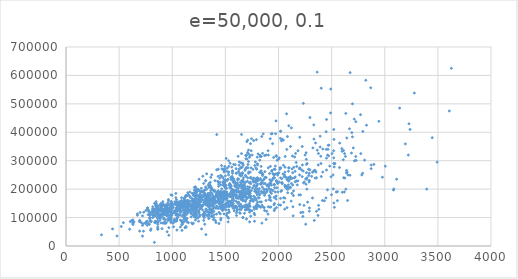
| Category | Series 0 |
|---|---|
| 1710.0 | 208500 |
| 1262.0 | 181500 |
| 1786.0 | 223500 |
| 1717.0 | 140000 |
| 2198.0 | 250000 |
| 1362.0 | 143000 |
| 1694.0 | 307000 |
| 2090.0 | 200000 |
| 1774.0 | 129900 |
| 1077.0 | 118000 |
| 1040.0 | 129500 |
| 2324.0 | 345000 |
| 912.0 | 144000 |
| 1494.0 | 279500 |
| 1253.0 | 157000 |
| 854.0 | 132000 |
| 1004.0 | 149000 |
| 1296.0 | 90000 |
| 1114.0 | 159000 |
| 1339.0 | 139000 |
| 2376.0 | 325300 |
| 1108.0 | 139400 |
| 1795.0 | 230000 |
| 1060.0 | 129900 |
| 1060.0 | 154000 |
| 1600.0 | 256300 |
| 900.0 | 134800 |
| 1704.0 | 306000 |
| 1600.0 | 207500 |
| 520.0 | 68500 |
| 1317.0 | 40000 |
| 1228.0 | 149350 |
| 1234.0 | 179900 |
| 1700.0 | 165500 |
| 1561.0 | 277500 |
| 2452.0 | 309000 |
| 1097.0 | 145000 |
| 1297.0 | 153000 |
| 1057.0 | 109000 |
| 1152.0 | 82000 |
| 1324.0 | 160000 |
| 1328.0 | 170000 |
| 884.0 | 144000 |
| 938.0 | 130250 |
| 1150.0 | 141000 |
| 1752.0 | 319900 |
| 2149.0 | 239686 |
| 1656.0 | 249700 |
| 1452.0 | 113000 |
| 955.0 | 127000 |
| 1470.0 | 177000 |
| 1176.0 | 114500 |
| 816.0 | 110000 |
| 1842.0 | 385000 |
| 1360.0 | 130000 |
| 1425.0 | 180500 |
| 1739.0 | 172500 |
| 1720.0 | 196500 |
| 2945.0 | 438780 |
| 780.0 | 124900 |
| 1158.0 | 158000 |
| 1111.0 | 101000 |
| 1370.0 | 202500 |
| 1710.0 | 140000 |
| 2034.0 | 219500 |
| 2473.0 | 317000 |
| 2207.0 | 180000 |
| 1479.0 | 226000 |
| 747.0 | 80000 |
| 2287.0 | 225000 |
| 2223.0 | 244000 |
| 845.0 | 129500 |
| 1718.0 | 185000 |
| 1086.0 | 144900 |
| 1605.0 | 107400 |
| 988.0 | 91000 |
| 952.0 | 135750 |
| 1285.0 | 127000 |
| 1768.0 | 136500 |
| 1230.0 | 110000 |
| 2142.0 | 193500 |
| 1337.0 | 153500 |
| 1563.0 | 245000 |
| 1065.0 | 126500 |
| 1474.0 | 168500 |
| 2417.0 | 260000 |
| 1560.0 | 174000 |
| 1224.0 | 164500 |
| 1526.0 | 85000 |
| 990.0 | 123600 |
| 1040.0 | 109900 |
| 1235.0 | 98600 |
| 964.0 | 163500 |
| 2291.0 | 133900 |
| 1786.0 | 204750 |
| 1470.0 | 185000 |
| 1588.0 | 214000 |
| 960.0 | 94750 |
| 835.0 | 83000 |
| 1225.0 | 128950 |
| 1610.0 | 205000 |
| 1732.0 | 178000 |
| 1535.0 | 118964 |
| 1226.0 | 198900 |
| 1818.0 | 169500 |
| 1992.0 | 250000 |
| 1047.0 | 100000 |
| 789.0 | 115000 |
| 1517.0 | 115000 |
| 1844.0 | 190000 |
| 1855.0 | 136900 |
| 1430.0 | 180000 |
| 2696.0 | 383970 |
| 2259.0 | 217000 |
| 2320.0 | 259500 |
| 1458.0 | 176000 |
| 1092.0 | 139000 |
| 1125.0 | 155000 |
| 3222.0 | 320000 |
| 1456.0 | 163990 |
| 988.0 | 180000 |
| 1123.0 | 100000 |
| 1080.0 | 136000 |
| 1199.0 | 153900 |
| 1586.0 | 181000 |
| 754.0 | 84500 |
| 958.0 | 128000 |
| 840.0 | 87000 |
| 1348.0 | 155000 |
| 1053.0 | 150000 |
| 2157.0 | 226000 |
| 2054.0 | 244000 |
| 1327.0 | 150750 |
| 1296.0 | 220000 |
| 1721.0 | 180000 |
| 1682.0 | 174000 |
| 1214.0 | 143000 |
| 1959.0 | 171000 |
| 1852.0 | 230000 |
| 1764.0 | 231500 |
| 864.0 | 115000 |
| 1734.0 | 260000 |
| 1385.0 | 166000 |
| 1501.0 | 204000 |
| 1728.0 | 125000 |
| 1709.0 | 130000 |
| 875.0 | 105000 |
| 2035.0 | 222500 |
| 1080.0 | 141000 |
| 1344.0 | 115000 |
| 969.0 | 122000 |
| 1710.0 | 372402 |
| 1993.0 | 190000 |
| 1252.0 | 235000 |
| 1200.0 | 125000 |
| 1096.0 | 79000 |
| 1040.0 | 109500 |
| 1968.0 | 269500 |
| 1947.0 | 254900 |
| 2462.0 | 320000 |
| 1232.0 | 162500 |
| 2668.0 | 412500 |
| 1541.0 | 220000 |
| 882.0 | 103200 |
| 1616.0 | 152000 |
| 1355.0 | 127500 |
| 1867.0 | 190000 |
| 2161.0 | 325624 |
| 1720.0 | 183500 |
| 1707.0 | 228000 |
| 1382.0 | 128500 |
| 1656.0 | 215000 |
| 1767.0 | 239000 |
| 1362.0 | 163000 |
| 1651.0 | 184000 |
| 2158.0 | 243000 |
| 2060.0 | 211000 |
| 1920.0 | 172500 |
| 2234.0 | 501837 |
| 968.0 | 100000 |
| 1525.0 | 177000 |
| 1802.0 | 200100 |
| 1340.0 | 120000 |
| 2082.0 | 200000 |
| 1252.0 | 127000 |
| 3608.0 | 475000 |
| 1217.0 | 173000 |
| 1656.0 | 135000 |
| 1224.0 | 153337 |
| 1593.0 | 286000 |
| 2727.0 | 315000 |
| 1479.0 | 184000 |
| 1431.0 | 192000 |
| 1709.0 | 130000 |
| 864.0 | 127000 |
| 1456.0 | 148500 |
| 1726.0 | 311872 |
| 3112.0 | 235000 |
| 2229.0 | 104000 |
| 1713.0 | 274900 |
| 1121.0 | 140000 |
| 1279.0 | 171500 |
| 1310.0 | 112000 |
| 848.0 | 149000 |
| 1284.0 | 110000 |
| 1442.0 | 180500 |
| 1696.0 | 143900 |
| 1100.0 | 141000 |
| 2062.0 | 277000 |
| 1092.0 | 145000 |
| 864.0 | 98000 |
| 1212.0 | 186000 |
| 1852.0 | 252678 |
| 990.0 | 156000 |
| 1392.0 | 161750 |
| 1236.0 | 134450 |
| 1436.0 | 210000 |
| 1328.0 | 107000 |
| 1954.0 | 311500 |
| 1248.0 | 167240 |
| 1498.0 | 204900 |
| 2267.0 | 200000 |
| 1552.0 | 179900 |
| 864.0 | 97000 |
| 2392.0 | 386250 |
| 1302.0 | 112000 |
| 2520.0 | 290000 |
| 987.0 | 106000 |
| 912.0 | 125000 |
| 1555.0 | 192500 |
| 1194.0 | 148000 |
| 2794.0 | 403000 |
| 987.0 | 94500 |
| 894.0 | 128200 |
| 1960.0 | 216500 |
| 987.0 | 89500 |
| 1414.0 | 185500 |
| 1744.0 | 194500 |
| 1694.0 | 318000 |
| 1487.0 | 113000 |
| 1566.0 | 262500 |
| 866.0 | 110500 |
| 1440.0 | 79000 |
| 1217.0 | 120000 |
| 2110.0 | 205000 |
| 1872.0 | 241500 |
| 1928.0 | 137000 |
| 1375.0 | 140000 |
| 1668.0 | 180000 |
| 2144.0 | 277000 |
| 1306.0 | 76500 |
| 1625.0 | 235000 |
| 1640.0 | 173000 |
| 1302.0 | 158000 |
| 1314.0 | 145000 |
| 2291.0 | 230000 |
| 1728.0 | 207500 |
| 1604.0 | 220000 |
| 1792.0 | 231500 |
| 882.0 | 97000 |
| 1382.0 | 176000 |
| 2574.0 | 276000 |
| 1212.0 | 151000 |
| 1316.0 | 130000 |
| 764.0 | 73000 |
| 1422.0 | 175500 |
| 1511.0 | 185000 |
| 2192.0 | 179500 |
| 778.0 | 120500 |
| 1113.0 | 148000 |
| 1939.0 | 266000 |
| 1363.0 | 241500 |
| 2270.0 | 290000 |
| 1632.0 | 139000 |
| 816.0 | 124500 |
| 1548.0 | 205000 |
| 1560.0 | 201000 |
| 864.0 | 141000 |
| 2121.0 | 415298 |
| 2022.0 | 192000 |
| 1982.0 | 228500 |
| 1262.0 | 185000 |
| 1314.0 | 207500 |
| 1468.0 | 244600 |
| 1575.0 | 179200 |
| 1250.0 | 164700 |
| 1734.0 | 159000 |
| 858.0 | 88000 |
| 900.0 | 122000 |
| 1396.0 | 153575 |
| 1919.0 | 233230 |
| 1716.0 | 135900 |
| 1716.0 | 131000 |
| 2263.0 | 235000 |
| 1644.0 | 167000 |
| 1003.0 | 142500 |
| 1558.0 | 152000 |
| 1950.0 | 239000 |
| 1743.0 | 175000 |
| 1152.0 | 158500 |
| 1336.0 | 157000 |
| 2452.0 | 267000 |
| 1541.0 | 205000 |
| 894.0 | 149900 |
| 3493.0 | 295000 |
| 2000.0 | 305900 |
| 2243.0 | 225000 |
| 1406.0 | 89500 |
| 861.0 | 82500 |
| 1944.0 | 360000 |
| 1501.0 | 165600 |
| 972.0 | 132000 |
| 1118.0 | 119900 |
| 2036.0 | 375000 |
| 1641.0 | 178000 |
| 1432.0 | 188500 |
| 2353.0 | 260000 |
| 1959.0 | 270000 |
| 2646.0 | 260000 |
| 1472.0 | 187500 |
| 2596.0 | 342643 |
| 2468.0 | 354000 |
| 2730.0 | 301000 |
| 1163.0 | 126175 |
| 2978.0 | 242000 |
| 803.0 | 87000 |
| 1719.0 | 324000 |
| 1383.0 | 145250 |
| 2134.0 | 214500 |
| 1192.0 | 78000 |
| 1728.0 | 119000 |
| 1056.0 | 139000 |
| 1629.0 | 284000 |
| 1358.0 | 207000 |
| 1638.0 | 192000 |
| 1786.0 | 228950 |
| 1922.0 | 377426 |
| 1536.0 | 214000 |
| 1621.0 | 202500 |
| 1215.0 | 155000 |
| 1908.0 | 202900 |
| 841.0 | 82000 |
| 1040.0 | 87500 |
| 1684.0 | 266000 |
| 1112.0 | 85000 |
| 1577.0 | 140200 |
| 958.0 | 151500 |
| 1478.0 | 157500 |
| 1626.0 | 154000 |
| 2728.0 | 437154 |
| 1869.0 | 318061 |
| 1453.0 | 190000 |
| 1111.0 | 95000 |
| 720.0 | 105900 |
| 1595.0 | 140000 |
| 1200.0 | 177500 |
| 1167.0 | 173000 |
| 1142.0 | 134000 |
| 1352.0 | 130000 |
| 1924.0 | 280000 |
| 912.0 | 156000 |
| 1505.0 | 145000 |
| 1922.0 | 198500 |
| 987.0 | 118000 |
| 1574.0 | 190000 |
| 1344.0 | 147000 |
| 1394.0 | 159000 |
| 1431.0 | 165000 |
| 1268.0 | 132000 |
| 1287.0 | 162000 |
| 1664.0 | 172400 |
| 1588.0 | 134432 |
| 752.0 | 125000 |
| 1319.0 | 123000 |
| 1928.0 | 219500 |
| 904.0 | 61000 |
| 914.0 | 148000 |
| 2466.0 | 340000 |
| 1856.0 | 394432 |
| 1800.0 | 179000 |
| 1691.0 | 127000 |
| 1301.0 | 187750 |
| 1797.0 | 213500 |
| 784.0 | 76000 |
| 1953.0 | 240000 |
| 1269.0 | 192000 |
| 1184.0 | 81000 |
| 1125.0 | 125000 |
| 1479.0 | 191000 |
| 2332.0 | 426000 |
| 1367.0 | 119000 |
| 1961.0 | 215000 |
| 882.0 | 106500 |
| 788.0 | 100000 |
| 1034.0 | 109000 |
| 1144.0 | 129000 |
| 894.0 | 123000 |
| 1812.0 | 169500 |
| 1077.0 | 67000 |
| 1550.0 | 241000 |
| 1288.0 | 245500 |
| 1310.0 | 164990 |
| 672.0 | 108000 |
| 2263.0 | 258000 |
| 1572.0 | 168000 |
| 1620.0 | 150000 |
| 1639.0 | 115000 |
| 1680.0 | 177000 |
| 2172.0 | 280000 |
| 2078.0 | 339750 |
| 1276.0 | 60000 |
| 1056.0 | 145000 |
| 1478.0 | 222000 |
| 1028.0 | 115000 |
| 2097.0 | 228000 |
| 1340.0 | 181134 |
| 1400.0 | 149500 |
| 2624.0 | 239000 |
| 1134.0 | 126000 |
| 1056.0 | 142000 |
| 1344.0 | 206300 |
| 1602.0 | 215000 |
| 988.0 | 113000 |
| 2630.0 | 315000 |
| 1196.0 | 139000 |
| 1389.0 | 135000 |
| 1644.0 | 275000 |
| 907.0 | 109008 |
| 1208.0 | 195400 |
| 1412.0 | 175000 |
| 987.0 | 85400 |
| 1198.0 | 79900 |
| 1365.0 | 122500 |
| 1604.0 | 181000 |
| 630.0 | 81000 |
| 1661.0 | 212000 |
| 1118.0 | 116000 |
| 904.0 | 119000 |
| 694.0 | 90350 |
| 1196.0 | 110000 |
| 2402.0 | 555000 |
| 1440.0 | 118000 |
| 1573.0 | 162900 |
| 1258.0 | 172500 |
| 1908.0 | 210000 |
| 1689.0 | 127500 |
| 1888.0 | 190000 |
| 1886.0 | 199900 |
| 1376.0 | 119500 |
| 1183.0 | 120000 |
| 813.0 | 110000 |
| 1533.0 | 280000 |
| 1756.0 | 204000 |
| 1590.0 | 210000 |
| 1728.0 | 188000 |
| 1242.0 | 175500 |
| 1344.0 | 98000 |
| 1663.0 | 256000 |
| 1666.0 | 161000 |
| 1203.0 | 110000 |
| 1935.0 | 263435 |
| 1135.0 | 155000 |
| 864.0 | 62383 |
| 1660.0 | 188700 |
| 1040.0 | 124000 |
| 1414.0 | 178740 |
| 1277.0 | 167000 |
| 1644.0 | 146500 |
| 1634.0 | 250000 |
| 1710.0 | 187000 |
| 1502.0 | 212000 |
| 1969.0 | 190000 |
| 1072.0 | 148000 |
| 1976.0 | 440000 |
| 1652.0 | 251000 |
| 970.0 | 132500 |
| 1493.0 | 208900 |
| 2643.0 | 380000 |
| 1718.0 | 297000 |
| 1131.0 | 89471 |
| 1850.0 | 326000 |
| 1792.0 | 374000 |
| 1826.0 | 155000 |
| 1216.0 | 164000 |
| 999.0 | 132500 |
| 1113.0 | 147000 |
| 1073.0 | 156000 |
| 1484.0 | 175000 |
| 2414.0 | 160000 |
| 630.0 | 86000 |
| 1304.0 | 115000 |
| 1578.0 | 133000 |
| 1456.0 | 172785 |
| 1269.0 | 155000 |
| 886.0 | 91300 |
| 720.0 | 34900 |
| 3228.0 | 430000 |
| 1820.0 | 184000 |
| 899.0 | 130000 |
| 912.0 | 120000 |
| 1218.0 | 113000 |
| 1768.0 | 226700 |
| 1214.0 | 140000 |
| 1801.0 | 289000 |
| 1322.0 | 147000 |
| 1960.0 | 124500 |
| 1911.0 | 215000 |
| 1218.0 | 208300 |
| 1378.0 | 161000 |
| 1041.0 | 124500 |
| 1363.0 | 164900 |
| 1368.0 | 202665 |
| 864.0 | 129900 |
| 1080.0 | 134000 |
| 789.0 | 96500 |
| 2020.0 | 402861 |
| 2119.0 | 158000 |
| 2344.0 | 265000 |
| 1796.0 | 211000 |
| 2080.0 | 234000 |
| 1294.0 | 106250 |
| 1244.0 | 150000 |
| 1664.0 | 159000 |
| 2398.0 | 315750 |
| 1266.0 | 176000 |
| 928.0 | 132000 |
| 2713.0 | 446261 |
| 605.0 | 86000 |
| 2515.0 | 200624 |
| 1509.0 | 175000 |
| 1362.0 | 128000 |
| 827.0 | 107500 |
| 334.0 | 39300 |
| 1414.0 | 178000 |
| 1347.0 | 107500 |
| 1724.0 | 188000 |
| 864.0 | 111250 |
| 1159.0 | 158000 |
| 1601.0 | 272000 |
| 1838.0 | 315000 |
| 2285.0 | 248000 |
| 1680.0 | 213250 |
| 767.0 | 133000 |
| 1496.0 | 179665 |
| 2183.0 | 229000 |
| 1635.0 | 210000 |
| 768.0 | 129500 |
| 825.0 | 125000 |
| 2094.0 | 263000 |
| 1069.0 | 140000 |
| 928.0 | 112500 |
| 1717.0 | 255500 |
| 1126.0 | 108000 |
| 2046.0 | 284000 |
| 1048.0 | 113000 |
| 1092.0 | 141000 |
| 1336.0 | 108000 |
| 1446.0 | 175000 |
| 1557.0 | 234000 |
| 1392.0 | 121500 |
| 1389.0 | 170000 |
| 996.0 | 108000 |
| 1674.0 | 185000 |
| 2295.0 | 268000 |
| 1647.0 | 128000 |
| 2504.0 | 325000 |
| 1535.0 | 214000 |
| 2132.0 | 316600 |
| 943.0 | 135960 |
| 1728.0 | 142600 |
| 864.0 | 120000 |
| 1692.0 | 224500 |
| 1430.0 | 170000 |
| 1109.0 | 139000 |
| 1216.0 | 118500 |
| 1477.0 | 145000 |
| 1320.0 | 164500 |
| 1392.0 | 146000 |
| 1795.0 | 131500 |
| 1429.0 | 181900 |
| 2042.0 | 253293 |
| 816.0 | 118500 |
| 2775.0 | 325000 |
| 1573.0 | 133000 |
| 2028.0 | 369900 |
| 838.0 | 130000 |
| 860.0 | 137000 |
| 1473.0 | 143000 |
| 935.0 | 79500 |
| 1582.0 | 185900 |
| 2296.0 | 451950 |
| 816.0 | 138000 |
| 848.0 | 140000 |
| 924.0 | 110000 |
| 1826.0 | 319000 |
| 1368.0 | 114504 |
| 1402.0 | 194201 |
| 1647.0 | 217500 |
| 1556.0 | 151000 |
| 1904.0 | 275000 |
| 1375.0 | 141000 |
| 1915.0 | 220000 |
| 1200.0 | 151000 |
| 1494.0 | 221000 |
| 1986.0 | 205000 |
| 1040.0 | 152000 |
| 2008.0 | 225000 |
| 3194.0 | 359100 |
| 1029.0 | 118500 |
| 2153.0 | 313000 |
| 1032.0 | 148000 |
| 1872.0 | 261500 |
| 1120.0 | 147000 |
| 630.0 | 75500 |
| 1054.0 | 137500 |
| 1509.0 | 183200 |
| 832.0 | 105500 |
| 1828.0 | 314813 |
| 2262.0 | 305000 |
| 864.0 | 67000 |
| 2614.0 | 240000 |
| 980.0 | 135000 |
| 1512.0 | 168500 |
| 1790.0 | 165150 |
| 1116.0 | 160000 |
| 1422.0 | 139900 |
| 1520.0 | 153000 |
| 2080.0 | 135000 |
| 1350.0 | 168500 |
| 1750.0 | 124000 |
| 1554.0 | 209500 |
| 1411.0 | 82500 |
| 1056.0 | 139400 |
| 1056.0 | 144000 |
| 3395.0 | 200000 |
| 800.0 | 60000 |
| 1387.0 | 93000 |
| 796.0 | 85000 |
| 1567.0 | 264561 |
| 1518.0 | 274000 |
| 1929.0 | 226000 |
| 2704.0 | 345000 |
| 1620.0 | 152000 |
| 1766.0 | 370878 |
| 981.0 | 143250 |
| 1048.0 | 98300 |
| 1094.0 | 155000 |
| 1839.0 | 155000 |
| 630.0 | 84500 |
| 1665.0 | 205950 |
| 1510.0 | 108000 |
| 1716.0 | 191000 |
| 1469.0 | 135000 |
| 2113.0 | 350000 |
| 1092.0 | 88000 |
| 1053.0 | 145500 |
| 1502.0 | 149000 |
| 1458.0 | 97500 |
| 1486.0 | 167000 |
| 1935.0 | 197900 |
| 2448.0 | 402000 |
| 1392.0 | 110000 |
| 1181.0 | 137500 |
| 2097.0 | 423000 |
| 1936.0 | 230500 |
| 2380.0 | 129000 |
| 1679.0 | 193500 |
| 1437.0 | 168000 |
| 1180.0 | 137500 |
| 1476.0 | 173500 |
| 1369.0 | 103600 |
| 1208.0 | 165000 |
| 1839.0 | 257500 |
| 1136.0 | 140000 |
| 1441.0 | 148500 |
| 1774.0 | 87000 |
| 792.0 | 109500 |
| 2046.0 | 372500 |
| 988.0 | 128500 |
| 923.0 | 143000 |
| 1520.0 | 159434 |
| 1291.0 | 173000 |
| 1668.0 | 285000 |
| 1839.0 | 221000 |
| 2090.0 | 207500 |
| 1761.0 | 227875 |
| 1102.0 | 148800 |
| 1419.0 | 392000 |
| 1362.0 | 194700 |
| 848.0 | 141000 |
| 2519.0 | 335000 |
| 1073.0 | 108480 |
| 1539.0 | 141500 |
| 1137.0 | 176000 |
| 616.0 | 89000 |
| 1148.0 | 123500 |
| 894.0 | 138500 |
| 1391.0 | 196000 |
| 1800.0 | 312500 |
| 1164.0 | 140000 |
| 2576.0 | 361919 |
| 1812.0 | 140000 |
| 1484.0 | 213000 |
| 1092.0 | 55000 |
| 1824.0 | 302000 |
| 1324.0 | 254000 |
| 1456.0 | 179540 |
| 904.0 | 109900 |
| 729.0 | 52000 |
| 1178.0 | 102776 |
| 1228.0 | 189000 |
| 960.0 | 129000 |
| 1479.0 | 130500 |
| 1350.0 | 165000 |
| 2554.0 | 159500 |
| 1178.0 | 157000 |
| 2418.0 | 341000 |
| 971.0 | 128500 |
| 1742.0 | 275000 |
| 848.0 | 143000 |
| 864.0 | 124500 |
| 1470.0 | 135000 |
| 1698.0 | 320000 |
| 864.0 | 120500 |
| 1680.0 | 222000 |
| 1232.0 | 194500 |
| 1776.0 | 110000 |
| 1208.0 | 103000 |
| 1616.0 | 236500 |
| 1146.0 | 187500 |
| 2031.0 | 222500 |
| 1144.0 | 131400 |
| 948.0 | 108000 |
| 1768.0 | 163000 |
| 1040.0 | 93500 |
| 1801.0 | 239900 |
| 1200.0 | 179000 |
| 1728.0 | 190000 |
| 1432.0 | 132000 |
| 912.0 | 142000 |
| 1349.0 | 179000 |
| 1464.0 | 175000 |
| 1337.0 | 180000 |
| 2715.0 | 299800 |
| 2256.0 | 236000 |
| 2640.0 | 265979 |
| 1720.0 | 260400 |
| 1529.0 | 98000 |
| 1140.0 | 96500 |
| 1320.0 | 162000 |
| 1494.0 | 217000 |
| 2098.0 | 275500 |
| 1026.0 | 156000 |
| 1471.0 | 172500 |
| 1768.0 | 212000 |
| 1386.0 | 158900 |
| 1501.0 | 179400 |
| 2531.0 | 290000 |
| 864.0 | 127500 |
| 1301.0 | 100000 |
| 1547.0 | 215200 |
| 2365.0 | 337000 |
| 1494.0 | 270000 |
| 1506.0 | 264132 |
| 1714.0 | 196500 |
| 1750.0 | 160000 |
| 1836.0 | 216837 |
| 3279.0 | 538000 |
| 858.0 | 134900 |
| 1220.0 | 102000 |
| 1117.0 | 107000 |
| 912.0 | 114500 |
| 1973.0 | 395000 |
| 1204.0 | 162000 |
| 1614.0 | 221500 |
| 894.0 | 142500 |
| 2020.0 | 144000 |
| 1004.0 | 135000 |
| 1253.0 | 176000 |
| 1603.0 | 175900 |
| 1430.0 | 187100 |
| 1110.0 | 165500 |
| 1484.0 | 128000 |
| 1342.0 | 161500 |
| 1652.0 | 139000 |
| 2084.0 | 233000 |
| 901.0 | 107900 |
| 2087.0 | 187500 |
| 1145.0 | 160200 |
| 1062.0 | 146800 |
| 2013.0 | 269790 |
| 1496.0 | 225000 |
| 1895.0 | 194500 |
| 1564.0 | 171000 |
| 1285.0 | 143500 |
| 773.0 | 110000 |
| 3140.0 | 485000 |
| 1768.0 | 175000 |
| 1688.0 | 200000 |
| 1196.0 | 109900 |
| 1456.0 | 189000 |
| 2822.0 | 582933 |
| 1128.0 | 118000 |
| 1428.0 | 227680 |
| 980.0 | 135500 |
| 1576.0 | 223500 |
| 1086.0 | 159950 |
| 2138.0 | 106000 |
| 1309.0 | 181000 |
| 848.0 | 144500 |
| 1044.0 | 55993 |
| 1442.0 | 157900 |
| 1250.0 | 116000 |
| 1661.0 | 224900 |
| 1008.0 | 137000 |
| 1689.0 | 271000 |
| 1052.0 | 155000 |
| 1358.0 | 224000 |
| 1640.0 | 183000 |
| 936.0 | 93000 |
| 1733.0 | 225000 |
| 1489.0 | 139500 |
| 1489.0 | 232600 |
| 2084.0 | 385000 |
| 784.0 | 109500 |
| 1434.0 | 189000 |
| 2126.0 | 185000 |
| 1223.0 | 147400 |
| 1392.0 | 166000 |
| 1200.0 | 151000 |
| 1829.0 | 237000 |
| 1516.0 | 167000 |
| 1144.0 | 139950 |
| 1067.0 | 128000 |
| 1559.0 | 153500 |
| 987.0 | 100000 |
| 1099.0 | 144000 |
| 1200.0 | 130500 |
| 1482.0 | 140000 |
| 1539.0 | 157500 |
| 1165.0 | 174900 |
| 1800.0 | 141000 |
| 1416.0 | 153900 |
| 1701.0 | 171000 |
| 1775.0 | 213000 |
| 864.0 | 133500 |
| 2358.0 | 240000 |
| 1855.0 | 187000 |
| 848.0 | 131500 |
| 1456.0 | 215000 |
| 1646.0 | 164000 |
| 1445.0 | 158000 |
| 1779.0 | 170000 |
| 1040.0 | 127000 |
| 1026.0 | 147000 |
| 1481.0 | 174000 |
| 1370.0 | 152000 |
| 2654.0 | 250000 |
| 1426.0 | 189950 |
| 1039.0 | 131500 |
| 1097.0 | 152000 |
| 1148.0 | 132500 |
| 1372.0 | 250580 |
| 1002.0 | 148500 |
| 1646.0 | 248900 |
| 1120.0 | 129000 |
| 2320.0 | 169000 |
| 1949.0 | 236000 |
| 894.0 | 109500 |
| 1682.0 | 200500 |
| 910.0 | 116000 |
| 1268.0 | 133000 |
| 1131.0 | 66500 |
| 2610.0 | 303477 |
| 1040.0 | 132250 |
| 2224.0 | 350000 |
| 1155.0 | 148000 |
| 864.0 | 136500 |
| 1090.0 | 157000 |
| 1717.0 | 187500 |
| 1593.0 | 178000 |
| 2230.0 | 118500 |
| 892.0 | 100000 |
| 1709.0 | 328900 |
| 1712.0 | 145000 |
| 1393.0 | 135500 |
| 2217.0 | 268000 |
| 1505.0 | 149500 |
| 924.0 | 122900 |
| 1683.0 | 172500 |
| 1068.0 | 154500 |
| 1383.0 | 165000 |
| 1535.0 | 118858 |
| 1796.0 | 140000 |
| 951.0 | 106500 |
| 2240.0 | 142953 |
| 2364.0 | 611657 |
| 1236.0 | 135000 |
| 858.0 | 110000 |
| 1306.0 | 153000 |
| 1509.0 | 180000 |
| 1670.0 | 240000 |
| 902.0 | 125500 |
| 1063.0 | 128000 |
| 1636.0 | 255000 |
| 2057.0 | 250000 |
| 902.0 | 131000 |
| 1484.0 | 174000 |
| 2274.0 | 154300 |
| 1268.0 | 143500 |
| 1015.0 | 88000 |
| 2002.0 | 145000 |
| 1224.0 | 173733 |
| 1092.0 | 75000 |
| 480.0 | 35311 |
| 1229.0 | 135000 |
| 2127.0 | 238000 |
| 1414.0 | 176500 |
| 1721.0 | 201000 |
| 2200.0 | 145900 |
| 1316.0 | 169990 |
| 1617.0 | 193000 |
| 1686.0 | 207500 |
| 1126.0 | 175000 |
| 2374.0 | 285000 |
| 1978.0 | 176000 |
| 1788.0 | 236500 |
| 2236.0 | 222000 |
| 1466.0 | 201000 |
| 925.0 | 117500 |
| 1905.0 | 320000 |
| 1500.0 | 190000 |
| 2069.0 | 242000 |
| 747.0 | 79900 |
| 1200.0 | 184900 |
| 1971.0 | 253000 |
| 1962.0 | 239799 |
| 2403.0 | 244400 |
| 1728.0 | 150900 |
| 2060.0 | 214000 |
| 1440.0 | 150000 |
| 1632.0 | 143000 |
| 1344.0 | 137500 |
| 1869.0 | 124900 |
| 1144.0 | 143000 |
| 1629.0 | 270000 |
| 1776.0 | 192500 |
| 1381.0 | 197500 |
| 864.0 | 129000 |
| 965.0 | 119900 |
| 768.0 | 133900 |
| 1968.0 | 172000 |
| 980.0 | 127500 |
| 1958.0 | 145000 |
| 1229.0 | 124000 |
| 1057.0 | 132000 |
| 1337.0 | 185000 |
| 1416.0 | 155000 |
| 858.0 | 116500 |
| 2872.0 | 272000 |
| 1548.0 | 155000 |
| 1800.0 | 239000 |
| 1894.0 | 214900 |
| 1484.0 | 178900 |
| 1308.0 | 160000 |
| 1098.0 | 135000 |
| 968.0 | 37900 |
| 1095.0 | 140000 |
| 1192.0 | 135000 |
| 1626.0 | 173000 |
| 918.0 | 99500 |
| 1428.0 | 182000 |
| 2019.0 | 167500 |
| 1382.0 | 165000 |
| 869.0 | 85500 |
| 1241.0 | 199900 |
| 894.0 | 110000 |
| 1121.0 | 139000 |
| 999.0 | 178400 |
| 2612.0 | 336000 |
| 1266.0 | 159895 |
| 2290.0 | 255900 |
| 1734.0 | 126000 |
| 1164.0 | 125000 |
| 1635.0 | 117000 |
| 1940.0 | 395192 |
| 2030.0 | 195000 |
| 1576.0 | 197000 |
| 2392.0 | 348000 |
| 1742.0 | 168000 |
| 1851.0 | 187000 |
| 1500.0 | 173900 |
| 1718.0 | 337500 |
| 1230.0 | 121600 |
| 1050.0 | 136500 |
| 1442.0 | 185000 |
| 1077.0 | 91000 |
| 1208.0 | 206000 |
| 944.0 | 82000 |
| 691.0 | 86000 |
| 1574.0 | 232000 |
| 1680.0 | 136905 |
| 1504.0 | 181000 |
| 985.0 | 149900 |
| 1657.0 | 163500 |
| 1092.0 | 88000 |
| 1710.0 | 240000 |
| 1522.0 | 102000 |
| 1271.0 | 135000 |
| 1664.0 | 100000 |
| 1502.0 | 165000 |
| 1022.0 | 85000 |
| 1082.0 | 119200 |
| 1665.0 | 227000 |
| 1504.0 | 203000 |
| 1360.0 | 187500 |
| 1472.0 | 160000 |
| 1506.0 | 213490 |
| 1132.0 | 176000 |
| 1220.0 | 194000 |
| 1248.0 | 87000 |
| 1504.0 | 191000 |
| 2898.0 | 287000 |
| 882.0 | 112500 |
| 1264.0 | 167500 |
| 1646.0 | 293077 |
| 1376.0 | 105000 |
| 1218.0 | 118000 |
| 1928.0 | 160000 |
| 3082.0 | 197000 |
| 2520.0 | 310000 |
| 1654.0 | 230000 |
| 954.0 | 119750 |
| 845.0 | 84000 |
| 1620.0 | 315500 |
| 2263.0 | 287000 |
| 1344.0 | 97000 |
| 630.0 | 80000 |
| 1803.0 | 155000 |
| 1632.0 | 173000 |
| 1306.0 | 196000 |
| 2329.0 | 262280 |
| 2524.0 | 278000 |
| 1733.0 | 139600 |
| 2868.0 | 556581 |
| 990.0 | 145000 |
| 1771.0 | 115000 |
| 930.0 | 84900 |
| 1302.0 | 176485 |
| 1316.0 | 200141 |
| 1977.0 | 165000 |
| 1526.0 | 144500 |
| 1989.0 | 255000 |
| 1523.0 | 180000 |
| 1364.0 | 185850 |
| 1850.0 | 248000 |
| 2184.0 | 335000 |
| 1991.0 | 220000 |
| 1338.0 | 213500 |
| 894.0 | 81000 |
| 2337.0 | 90000 |
| 1103.0 | 110500 |
| 1154.0 | 154000 |
| 2260.0 | 328000 |
| 1571.0 | 178000 |
| 1611.0 | 167900 |
| 2521.0 | 151400 |
| 893.0 | 135000 |
| 1048.0 | 135000 |
| 1556.0 | 154000 |
| 1456.0 | 91500 |
| 1426.0 | 159500 |
| 1240.0 | 194000 |
| 1740.0 | 219500 |
| 1466.0 | 170000 |
| 1096.0 | 138800 |
| 848.0 | 155900 |
| 990.0 | 126000 |
| 1258.0 | 145000 |
| 1040.0 | 133000 |
| 1459.0 | 192000 |
| 1251.0 | 160000 |
| 1498.0 | 187500 |
| 996.0 | 147000 |
| 1092.0 | 83500 |
| 1953.0 | 252000 |
| 1709.0 | 137500 |
| 1247.0 | 197000 |
| 1040.0 | 92900 |
| 1252.0 | 160000 |
| 1694.0 | 136500 |
| 1200.0 | 146000 |
| 936.0 | 129000 |
| 1314.0 | 176432 |
| 1355.0 | 127000 |
| 1088.0 | 170000 |
| 1324.0 | 128000 |
| 1601.0 | 157000 |
| 438.0 | 60000 |
| 950.0 | 119500 |
| 1134.0 | 135000 |
| 1194.0 | 159500 |
| 1302.0 | 106000 |
| 2622.0 | 325000 |
| 1442.0 | 179900 |
| 2021.0 | 274725 |
| 1690.0 | 181000 |
| 1836.0 | 280000 |
| 1658.0 | 188000 |
| 1964.0 | 205000 |
| 816.0 | 129900 |
| 1008.0 | 134500 |
| 833.0 | 117000 |
| 1734.0 | 318000 |
| 1419.0 | 184100 |
| 894.0 | 130000 |
| 1601.0 | 140000 |
| 1040.0 | 133700 |
| 1012.0 | 118400 |
| 1552.0 | 212900 |
| 960.0 | 112000 |
| 698.0 | 118000 |
| 1482.0 | 163900 |
| 1005.0 | 115000 |
| 1555.0 | 174000 |
| 1530.0 | 259000 |
| 1959.0 | 215000 |
| 936.0 | 140000 |
| 1981.0 | 135000 |
| 974.0 | 93500 |
| 2210.0 | 117500 |
| 2020.0 | 239500 |
| 1600.0 | 169000 |
| 986.0 | 102000 |
| 1252.0 | 119000 |
| 1020.0 | 94000 |
| 1567.0 | 196000 |
| 1167.0 | 144000 |
| 952.0 | 139000 |
| 1868.0 | 197500 |
| 2828.0 | 424870 |
| 1006.0 | 80000 |
| 924.0 | 80000 |
| 1576.0 | 149000 |
| 1298.0 | 180000 |
| 1564.0 | 174500 |
| 1111.0 | 116900 |
| 1482.0 | 143000 |
| 932.0 | 124000 |
| 1466.0 | 149900 |
| 1811.0 | 230000 |
| 816.0 | 120500 |
| 1820.0 | 201800 |
| 1437.0 | 218000 |
| 1265.0 | 179900 |
| 1314.0 | 230000 |
| 1580.0 | 235128 |
| 1876.0 | 185000 |
| 1456.0 | 146000 |
| 1640.0 | 224000 |
| 894.0 | 129000 |
| 1258.0 | 108959 |
| 1432.0 | 194000 |
| 1502.0 | 233170 |
| 1694.0 | 245350 |
| 1671.0 | 173000 |
| 2108.0 | 235000 |
| 3627.0 | 625000 |
| 1118.0 | 171000 |
| 1261.0 | 163000 |
| 1250.0 | 171900 |
| 3086.0 | 200500 |
| 2345.0 | 239000 |
| 2872.0 | 285000 |
| 923.0 | 119500 |
| 1224.0 | 115000 |
| 1343.0 | 154900 |
| 1124.0 | 93000 |
| 2514.0 | 250000 |
| 1652.0 | 392500 |
| 1130.0 | 120000 |
| 1572.0 | 186700 |
| 1221.0 | 104900 |
| 1699.0 | 95000 |
| 1624.0 | 262000 |
| 1660.0 | 195000 |
| 1804.0 | 189000 |
| 1622.0 | 168000 |
| 1441.0 | 174000 |
| 1472.0 | 125000 |
| 1224.0 | 165000 |
| 1352.0 | 158000 |
| 1456.0 | 176000 |
| 1863.0 | 219210 |
| 1690.0 | 144000 |
| 1212.0 | 178000 |
| 1382.0 | 148000 |
| 864.0 | 116050 |
| 1779.0 | 197900 |
| 1348.0 | 117000 |
| 1630.0 | 213000 |
| 1074.0 | 153500 |
| 2196.0 | 271900 |
| 1056.0 | 107000 |
| 1700.0 | 200000 |
| 1283.0 | 140000 |
| 1660.0 | 290000 |
| 1845.0 | 189000 |
| 1752.0 | 164000 |
| 672.0 | 113000 |
| 960.0 | 145000 |
| 999.0 | 134500 |
| 894.0 | 125000 |
| 1902.0 | 112000 |
| 1314.0 | 229456 |
| 912.0 | 80500 |
| 1218.0 | 91500 |
| 912.0 | 115000 |
| 1211.0 | 134000 |
| 1846.0 | 143000 |
| 2136.0 | 137900 |
| 1490.0 | 184000 |
| 1138.0 | 145000 |
| 1933.0 | 214000 |
| 912.0 | 147000 |
| 1702.0 | 367294 |
| 1507.0 | 127000 |
| 2620.0 | 190000 |
| 1190.0 | 132500 |
| 1224.0 | 101800 |
| 1188.0 | 142000 |
| 1964.0 | 130000 |
| 1784.0 | 138887 |
| 1626.0 | 175500 |
| 1948.0 | 195000 |
| 1141.0 | 142500 |
| 1484.0 | 265900 |
| 1768.0 | 224900 |
| 1689.0 | 248328 |
| 1173.0 | 170000 |
| 2076.0 | 465000 |
| 1517.0 | 230000 |
| 1868.0 | 178000 |
| 1553.0 | 186500 |
| 1034.0 | 169900 |
| 2058.0 | 129500 |
| 988.0 | 119000 |
| 2110.0 | 244000 |
| 1405.0 | 171750 |
| 874.0 | 130000 |
| 2167.0 | 294000 |
| 1656.0 | 165400 |
| 1367.0 | 127500 |
| 1987.0 | 301500 |
| 864.0 | 99900 |
| 1166.0 | 190000 |
| 1054.0 | 151000 |
| 1675.0 | 181000 |
| 1050.0 | 128900 |
| 1788.0 | 161500 |
| 1824.0 | 180500 |
| 1337.0 | 181000 |
| 1452.0 | 183900 |
| 1889.0 | 122000 |
| 2018.0 | 378500 |
| 3447.0 | 381000 |
| 1524.0 | 144000 |
| 1524.0 | 260000 |
| 1489.0 | 185750 |
| 935.0 | 137000 |
| 1357.0 | 177000 |
| 1250.0 | 139000 |
| 1920.0 | 137000 |
| 1395.0 | 162000 |
| 1724.0 | 197900 |
| 2031.0 | 237000 |
| 1128.0 | 68400 |
| 1573.0 | 227000 |
| 1339.0 | 180000 |
| 1040.0 | 150500 |
| 1824.0 | 139000 |
| 2447.0 | 169000 |
| 1412.0 | 132500 |
| 1328.0 | 143000 |
| 1582.0 | 190000 |
| 1659.0 | 278000 |
| 1970.0 | 281000 |
| 1152.0 | 180500 |
| 1302.0 | 119500 |
| 2372.0 | 107500 |
| 1664.0 | 162900 |
| 864.0 | 115000 |
| 1052.0 | 138500 |
| 1128.0 | 155000 |
| 1072.0 | 140000 |
| 1246.0 | 154000 |
| 1983.0 | 225000 |
| 1494.0 | 177500 |
| 2526.0 | 290000 |
| 1616.0 | 232000 |
| 1708.0 | 130000 |
| 1652.0 | 325000 |
| 1368.0 | 202500 |
| 990.0 | 138000 |
| 1122.0 | 147000 |
| 1294.0 | 179200 |
| 1902.0 | 335000 |
| 1274.0 | 203000 |
| 2810.0 | 302000 |
| 2599.0 | 333168 |
| 948.0 | 119000 |
| 2112.0 | 206900 |
| 1630.0 | 295493 |
| 1352.0 | 208900 |
| 1787.0 | 275000 |
| 948.0 | 111000 |
| 1478.0 | 156500 |
| 720.0 | 72500 |
| 1923.0 | 190000 |
| 708.0 | 82500 |
| 1795.0 | 147000 |
| 796.0 | 55000 |
| 774.0 | 79000 |
| 816.0 | 130500 |
| 2792.0 | 256000 |
| 1632.0 | 176500 |
| 1588.0 | 227000 |
| 954.0 | 132500 |
| 816.0 | 100000 |
| 1360.0 | 125500 |
| 1365.0 | 125000 |
| 1334.0 | 167900 |
| 1656.0 | 135000 |
| 693.0 | 52500 |
| 1861.0 | 200000 |
| 864.0 | 128500 |
| 872.0 | 123000 |
| 1114.0 | 155000 |
| 2169.0 | 228500 |
| 1913.0 | 177000 |
| 1456.0 | 155835 |
| 960.0 | 108500 |
| 2156.0 | 262500 |
| 1776.0 | 283463 |
| 1494.0 | 215000 |
| 2358.0 | 122000 |
| 2634.0 | 200000 |
| 1716.0 | 171000 |
| 1176.0 | 134900 |
| 3238.0 | 410000 |
| 1865.0 | 235000 |
| 1920.0 | 170000 |
| 892.0 | 110000 |
| 1078.0 | 149900 |
| 1573.0 | 177500 |
| 1980.0 | 315000 |
| 2601.0 | 189000 |
| 1530.0 | 260000 |
| 1738.0 | 104900 |
| 1412.0 | 156932 |
| 1200.0 | 144152 |
| 1674.0 | 216000 |
| 1790.0 | 193000 |
| 1475.0 | 127000 |
| 848.0 | 144000 |
| 1668.0 | 232000 |
| 1374.0 | 105000 |
| 1661.0 | 165500 |
| 2097.0 | 274300 |
| 2633.0 | 466500 |
| 1958.0 | 250000 |
| 1571.0 | 239000 |
| 790.0 | 91000 |
| 1604.0 | 117000 |
| 987.0 | 83000 |
| 1394.0 | 167500 |
| 864.0 | 58500 |
| 2117.0 | 237500 |
| 1762.0 | 157000 |
| 1416.0 | 112000 |
| 1258.0 | 105000 |
| 1154.0 | 125500 |
| 2784.0 | 250000 |
| 2526.0 | 136000 |
| 1746.0 | 377500 |
| 1218.0 | 131000 |
| 1525.0 | 235000 |
| 1584.0 | 124000 |
| 900.0 | 123000 |
| 1912.0 | 163000 |
| 1500.0 | 246578 |
| 2482.0 | 281213 |
| 1687.0 | 160000 |
| 1513.0 | 137500 |
| 1904.0 | 138000 |
| 1608.0 | 137450 |
| 1158.0 | 120000 |
| 1593.0 | 193000 |
| 1294.0 | 193879 |
| 1464.0 | 282922 |
| 1214.0 | 105000 |
| 1646.0 | 275000 |
| 768.0 | 133000 |
| 833.0 | 112000 |
| 1363.0 | 125500 |
| 2093.0 | 215000 |
| 1840.0 | 230000 |
| 1668.0 | 140000 |
| 1040.0 | 90000 |
| 1844.0 | 257000 |
| 1848.0 | 207000 |
| 1569.0 | 175900 |
| 2290.0 | 122500 |
| 2450.0 | 340000 |
| 1144.0 | 124000 |
| 1844.0 | 223000 |
| 1416.0 | 179900 |
| 1069.0 | 127500 |
| 848.0 | 136500 |
| 2201.0 | 274970 |
| 1344.0 | 144000 |
| 1252.0 | 142000 |
| 2127.0 | 271000 |
| 1558.0 | 140000 |
| 804.0 | 119000 |
| 1440.0 | 182900 |
| 1838.0 | 192140 |
| 958.0 | 143750 |
| 968.0 | 64500 |
| 1792.0 | 186500 |
| 1126.0 | 160000 |
| 1537.0 | 174000 |
| 864.0 | 120500 |
| 1932.0 | 394617 |
| 1236.0 | 149700 |
| 1725.0 | 197000 |
| 2555.0 | 191000 |
| 848.0 | 149300 |
| 2007.0 | 310000 |
| 952.0 | 121000 |
| 1422.0 | 179600 |
| 913.0 | 129000 |
| 1188.0 | 157900 |
| 2090.0 | 240000 |
| 1346.0 | 112000 |
| 630.0 | 92000 |
| 1792.0 | 136000 |
| 1578.0 | 287090 |
| 1072.0 | 145000 |
| 1140.0 | 84500 |
| 1221.0 | 185000 |
| 1647.0 | 175000 |
| 2073.0 | 210000 |
| 2340.0 | 266500 |
| 1078.0 | 142125 |
| 1256.0 | 147500 |
| 896.0 | 105000 |
| 1329.0 | 172000 |
| 1629.0 | 189900 |
| 1604.0 | 195500 |
| 1280.0 | 191500 |
| 1655.0 | 175900 |
| 1187.0 | 185000 |
| 1465.0 | 180400 |
| 1341.0 | 171500 |
| 882.0 | 126000 |
| 1337.0 | 184000 |
| 987.0 | 96000 |
| 1092.0 | 105500 |
| 1456.0 | 149900 |
| 836.0 | 120000 |
| 2334.0 | 376162 |
| 1544.0 | 290941 |
| 1698.0 | 275000 |
| 1822.0 | 259000 |
| 2696.0 | 500000 |
| 2250.0 | 320000 |
| 1370.0 | 205000 |
| 1324.0 | 199500 |
| 1145.0 | 160000 |
| 1374.0 | 184500 |
| 1733.0 | 185088 |
| 2475.0 | 355000 |
| 1595.0 | 221500 |
| 1218.0 | 204500 |
| 1468.0 | 271500 |
| 1659.0 | 181000 |
| 1012.0 | 67500 |
| 1494.0 | 169000 |
| 2349.0 | 362500 |
| 2225.0 | 285000 |
| 1488.0 | 260000 |
| 1680.0 | 190000 |
| 1200.0 | 155000 |
| 1200.0 | 149500 |
| 1236.0 | 152000 |
| 1512.0 | 177000 |
| 1080.0 | 147110 |
| 1418.0 | 267916 |
| 1848.0 | 254000 |
| 1492.0 | 230000 |
| 1829.0 | 218500 |
| 2495.0 | 243500 |
| 1891.0 | 212500 |
| 1645.0 | 171000 |
| 1232.0 | 142250 |
| 1209.0 | 159000 |
| 1510.0 | 178900 |
| 1775.0 | 136300 |
| 1728.0 | 84900 |
| 2461.0 | 197600 |
| 1556.0 | 172500 |
| 1128.0 | 178000 |
| 1604.0 | 135000 |
| 1480.0 | 214000 |
| 1143.0 | 136000 |
| 1206.0 | 108538 |
| 1580.0 | 159500 |
| 1337.0 | 108000 |
| 1064.0 | 135000 |
| 972.0 | 122500 |
| 988.0 | 119000 |
| 985.0 | 105000 |
| 1224.0 | 132000 |
| 1175.0 | 148000 |
| 1395.0 | 192000 |
| 1844.0 | 80400 |
| 936.0 | 109500 |
| 1347.0 | 143000 |
| 1251.0 | 119000 |
| 1633.0 | 129000 |
| 1245.0 | 100000 |
| 832.0 | 12789 |
| 1566.0 | 150000 |
| 2268.0 | 240000 |
| 2256.0 | 76500 |
| 1470.0 | 140750 |
| 1612.0 | 128500 |
| 2068.0 | 209500 |
| 765.0 | 87000 |
| 1132.0 | 134000 |
| 1196.0 | 128000 |
| 1453.0 | 132000 |
| 1416.0 | 139900 |
| 1040.0 | 123900 |
| 1536.0 | 138400 |
| 1068.0 | 109500 |
| 1962.0 | 149500 |
| 1560.0 | 159900 |
| 1324.0 | 122000 |
| 1675.0 | 173000 |
| 1224.0 | 107500 |
| 1392.0 | 100000 |
| 919.0 | 95000 |
| 1884.0 | 93369 |
| 1680.0 | 114900 |
| 1832.0 | 136000 |
| 892.0 | 137900 |
| 864.0 | 137250 |
| 1373.0 | 160250 |
| 1440.0 | 163000 |
| 1483.0 | 270000 |
| 756.0 | 85000 |
| 1981.0 | 230000 |
| 1610.0 | 124000 |
| 1074.0 | 144500 |
| 1531.0 | 127000 |
| 1172.0 | 128000 |
| 1508.0 | 308030 |
| 1298.0 | 114000 |
| 1433.0 | 270000 |
| 1802.0 | 218000 |
| 1222.0 | 187000 |
| 1445.0 | 138500 |
| 965.0 | 159000 |
| 1692.0 | 191000 |
| 1026.0 | 150000 |
| 876.0 | 127000 |
| 1978.0 | 318000 |
| 2098.0 | 240000 |
| 848.0 | 143750 |
| 640.0 | 84900 |
| 992.0 | 155891 |
| 1196.0 | 144000 |
| 1120.0 | 64000 |
| 1096.0 | 125200 |
| 960.0 | 90000 |
| 1296.0 | 104000 |
| 856.0 | 126000 |
| 2650.0 | 160000 |
| 1666.0 | 100000 |
| 2133.0 | 257500 |
| 2177.0 | 215000 |
| 1652.0 | 203135 |
| 1034.0 | 185000 |
| 1191.0 | 162500 |
| 540.0 | 82000 |
| 1107.0 | 110000 |
| 952.0 | 50138 |
| 1646.0 | 246000 |
| 1916.0 | 254900 |
| 1285.0 | 190000 |
| 2048.0 | 170000 |
| 1346.0 | 220000 |
| 1214.0 | 179781 |
| 1444.0 | 174000 |
| 1264.0 | 169000 |
| 1430.0 | 173500 |
| 1344.0 | 166500 |
| 945.0 | 119500 |
| 1092.0 | 76000 |
| 1092.0 | 88250 |
| 1092.0 | 85500 |
| 874.0 | 130000 |
| 833.0 | 149900 |
| 2432.0 | 159000 |
| 1274.0 | 136000 |
| 1479.0 | 161000 |
| 1803.0 | 285000 |
| 1797.0 | 231000 |
| 882.0 | 124500 |
| 1434.0 | 157000 |
| 1608.0 | 189500 |
| 2283.0 | 270000 |
| 1628.0 | 189000 |
| 2522.0 | 375000 |
| 1478.0 | 240000 |
| 1734.0 | 239500 |
| 1382.0 | 177500 |
| 1636.0 | 191000 |
| 1516.0 | 181316 |
| 1190.0 | 166000 |
| 1934.0 | 185000 |
| 2050.0 | 154000 |
| 1671.0 | 200000 |
| 2673.0 | 249000 |
| 1707.0 | 184000 |
| 1884.0 | 240900 |
| 1874.0 | 220000 |
| 1811.0 | 235000 |
| 1621.0 | 213000 |
| 1116.0 | 167900 |
| 1193.0 | 158000 |
| 1180.0 | 128000 |
| 1050.0 | 143000 |
| 864.0 | 76500 |
| 864.0 | 130000 |
| 987.0 | 111000 |
| 987.0 | 97000 |
| 1548.0 | 146000 |
| 1055.0 | 123000 |
| 1456.0 | 137900 |
| 1548.0 | 147000 |
| 1456.0 | 138000 |
| 836.0 | 128500 |
| 1120.0 | 148800 |
| 2772.0 | 462000 |
| 2690.0 | 398800 |
| 2020.0 | 404000 |
| 2674.0 | 610000 |
| 1736.0 | 360000 |
| 1782.0 | 296000 |
| 2520.0 | 409900 |
| 1743.0 | 335000 |
| 1531.0 | 300000 |
| 1808.0 | 324000 |
| 1760.0 | 269500 |
| 2452.0 | 445000 |
| 2400.0 | 290000 |
| 1606.0 | 255900 |
| 1358.0 | 213000 |
| 1306.0 | 184500 |
| 1358.0 | 212500 |
| 2492.0 | 552000 |
| 2200.0 | 382500 |
| 1884.0 | 320000 |
| 1456.0 | 248500 |
| 1712.0 | 286500 |
| 1405.0 | 173000 |
| 1456.0 | 184000 |
| 1490.0 | 167800 |
| 1220.0 | 180000 |
| 1374.0 | 170000 |
| 1630.0 | 189500 |
| 1594.0 | 195500 |
| 1489.0 | 192000 |
| 1342.0 | 178000 |
| 2004.0 | 257500 |
| 1374.0 | 167000 |
| 1514.0 | 190000 |
| 1430.0 | 156000 |
| 2312.0 | 245000 |
| 1430.0 | 168000 |
| 2687.0 | 327000 |
| 2063.0 | 315000 |
| 2061.0 | 260000 |
| 2232.0 | 263550 |
| 1696.0 | 275000 |
| 1658.0 | 257500 |
| 1702.0 | 275500 |
| 1432.0 | 245000 |
| 2490.0 | 468000 |
| 1436.0 | 225000 |
| 1402.0 | 229800 |
| 1530.0 | 250000 |
| 1448.0 | 238500 |
| 1795.0 | 270000 |
| 1836.0 | 264500 |
| 1662.0 | 291000 |
| 1553.0 | 234500 |
| 1653.0 | 209000 |
| 1218.0 | 159000 |
| 1141.0 | 152000 |
| 1158.0 | 143500 |
| 1812.0 | 193000 |
| 1512.0 | 203000 |
| 1114.0 | 159000 |
| 1114.0 | 142000 |
| 1114.0 | 153000 |
| 1450.0 | 224243 |
| 2122.0 | 220000 |
| 1730.0 | 171500 |
| 1332.0 | 145000 |
| 1540.0 | 184000 |
| 1400.0 | 162000 |
| 1882.0 | 160000 |
| 980.0 | 110000 |
| 864.0 | 141000 |
| 864.0 | 122000 |
| 1020.0 | 124100 |
| 912.0 | 129000 |
| 912.0 | 123000 |
| 2014.0 | 275000 |
| 1755.0 | 235000 |
| 3005.0 | 280750 |
| 1726.0 | 222000 |
| 1256.0 | 195000 |
| 1512.0 | 180000 |
| 1452.0 | 156000 |
| 1694.0 | 318750 |
| 1740.0 | 241600 |
| 2499.0 | 180500 |
| 2067.0 | 206000 |
| 2640.0 | 256900 |
| 1336.0 | 163000 |
| 1216.0 | 113000 |
| 2288.0 | 230000 |
| 864.0 | 130000 |
| 1568.0 | 143000 |
| 2061.0 | 168500 |
| 1320.0 | 172500 |
| 894.0 | 141500 |
| 864.0 | 118000 |
| 1362.0 | 140000 |
| 1728.0 | 177625 |
| 1313.0 | 153000 |
| 1292.0 | 145100 |
| 2140.0 | 177500 |
| 1576.0 | 174500 |
| 960.0 | 122000 |
| 1691.0 | 175000 |
| 1453.0 | 187500 |
| 1567.0 | 256000 |
| 1144.0 | 150000 |
| 1329.0 | 176000 |
| 988.0 | 149500 |
| 1202.0 | 120000 |
| 1382.0 | 153000 |
| 1200.0 | 144000 |
| 1866.0 | 135000 |
| 1062.0 | 131000 |
| 1112.0 | 126000 |
| 793.0 | 113000 |
| 1031.0 | 145500 |
| 1210.0 | 102900 |
| 1527.0 | 152500 |
| 1200.0 | 129900 |
| 792.0 | 99900 |
| 1352.0 | 149000 |
| 1039.0 | 114000 |
| 1078.0 | 125000 |
| 2377.0 | 142900 |
| 1690.0 | 156500 |
| 599.0 | 59000 |
| 846.0 | 106000 |
| 725.0 | 78500 |
| 2544.0 | 190000 |
| 1380.0 | 154000 |
| 1040.0 | 163000 |
| 951.0 | 143500 |
| 1105.0 | 135000 |
| 1142.0 | 113500 |
| 1133.0 | 128500 |
| 1041.0 | 128000 |
| 732.0 | 118900 |
| 1183.0 | 138000 |
| 1461.0 | 133500 |
| 1495.0 | 135000 |
| 1806.0 | 144750 |
| 941.0 | 145000 |